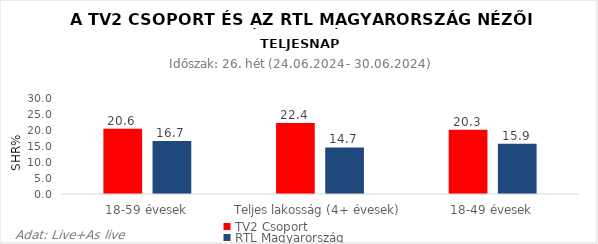
| Category | TV2 Csoport | RTL Magyarország |
|---|---|---|
| 18-59 évesek | 20.6 | 16.7 |
| Teljes lakosság (4+ évesek) | 22.4 | 14.7 |
| 18-49 évesek | 20.3 | 15.9 |